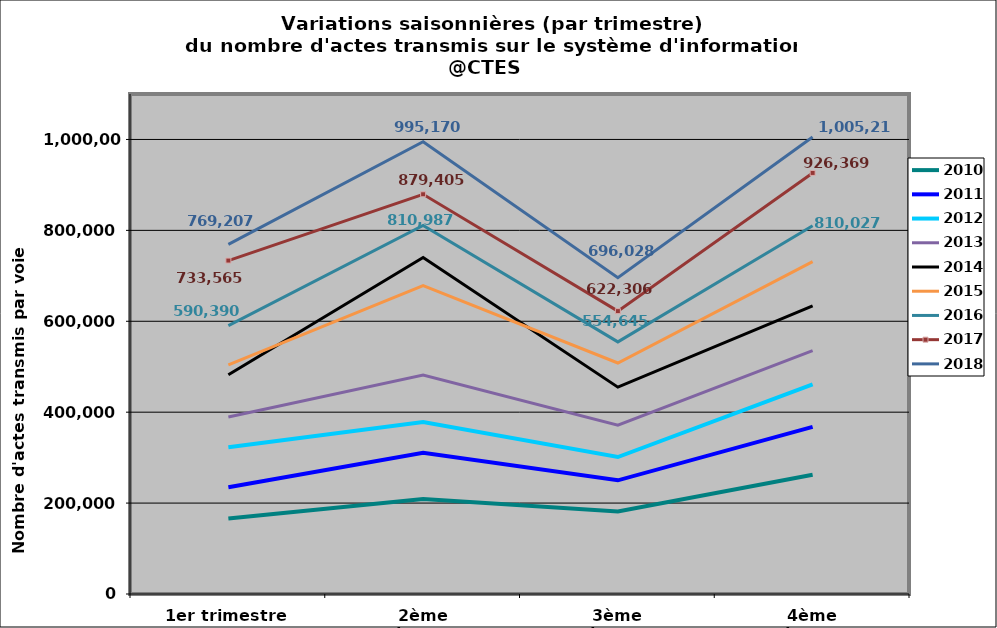
| Category | 2010 | 2011 | 2012 | 2013 | 2014 | 2015 | 2016 | 2017 | 2018 |
|---|---|---|---|---|---|---|---|---|---|
| 1er trimestre | 166072 | 235022 | 323082 | 389494 | 482461 | 504033 | 590390 | 733565 | 769207 |
| 2ème trimestre | 209207 | 310757 | 378417 | 481889 | 740429 | 678654 | 810987 | 879405 | 995170 |
| 3ème trimestre | 181314 | 250101 | 301334 | 371333 | 455118 | 508217 | 554645 | 622306 | 696028 |
| 4ème trimestre | 262476 | 367639 | 460937 | 535468 | 633834 | 731331 | 810027 | 926369 | 1005214 |